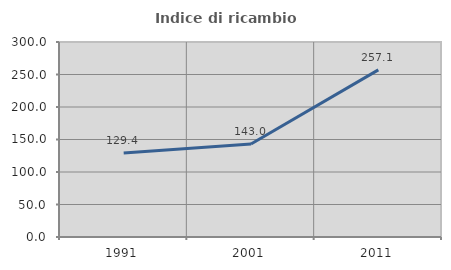
| Category | Indice di ricambio occupazionale  |
|---|---|
| 1991.0 | 129.412 |
| 2001.0 | 142.963 |
| 2011.0 | 257.143 |